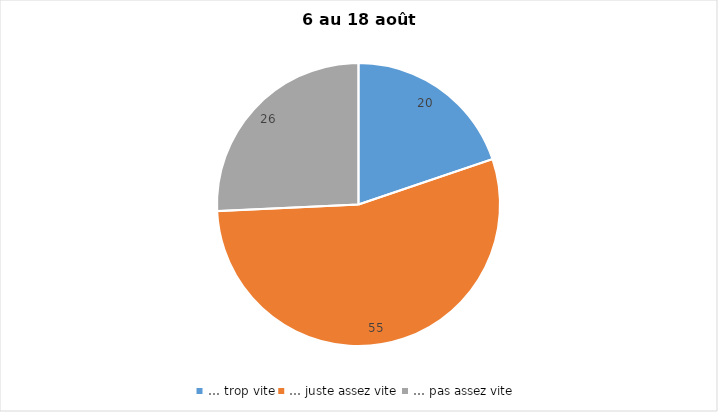
| Category | Series 0 |
|---|---|
| … trop vite | 20 |
| … juste assez vite | 55 |
| … pas assez vite | 26 |